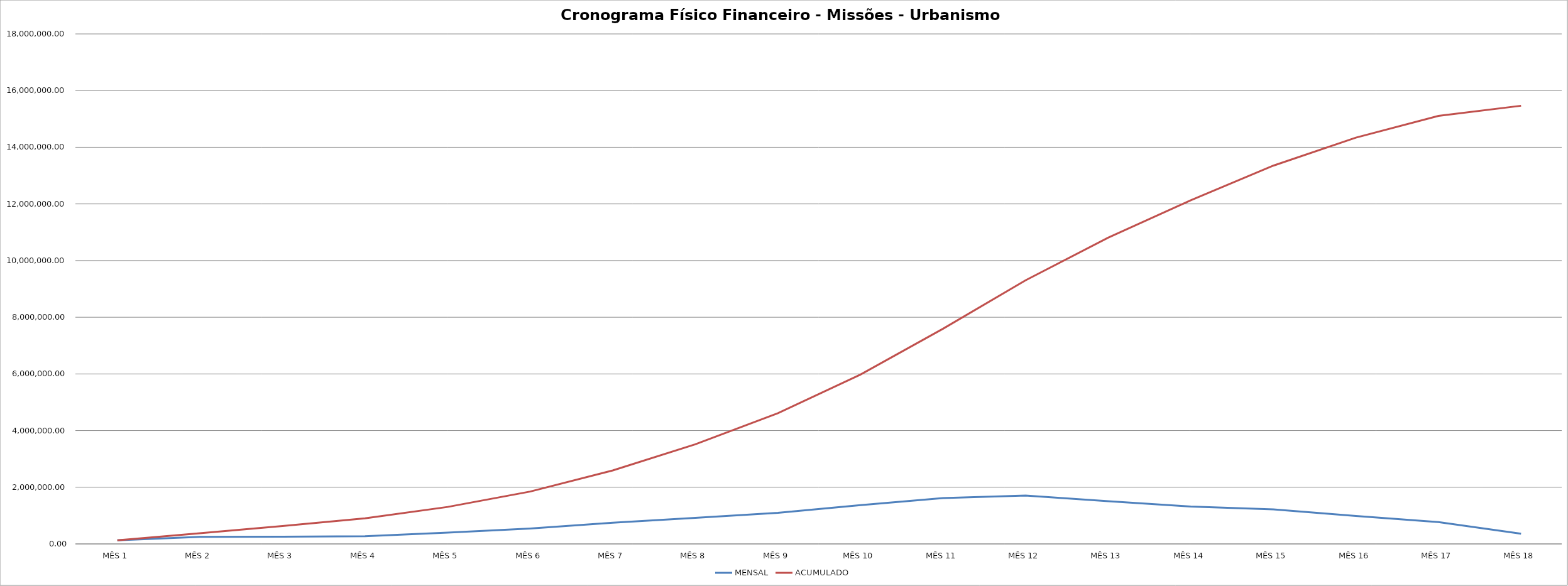
| Category | MENSAL | ACUMULADO |
|---|---|---|
| MÊS 1 | 128214.398 | 128214.398 |
| MÊS 2 | 247789.683 | 376004.081 |
| MÊS 3 | 255249.998 | 631254.078 |
| MÊS 4 | 272913.861 | 904167.939 |
| MÊS 5 | 400876.158 | 1305044.097 |
| MÊS 6 | 543217.099 | 1848261.195 |
| MÊS 7 | 746176.623 | 2594437.819 |
| MÊS 8 | 920523.86 | 3514961.678 |
| MÊS 9 | 1097109.6 | 4612071.278 |
| MÊS 10 | 1366293.586 | 5978364.864 |
| MÊS 11 | 1617369.053 | 7595733.917 |
| MÊS 12 | 1708140.06 | 9303873.977 |
| MÊS 13 | 1505092.303 | 10808966.279 |
| MÊS 14 | 1320770.93 | 12129737.21 |
| MÊS 15 | 1221536.455 | 13351273.664 |
| MÊS 16 | 987871.138 | 14339144.802 |
| MÊS 17 | 767884.062 | 15107028.865 |
| MÊS 18 | 357778.005 | 15464806.87 |